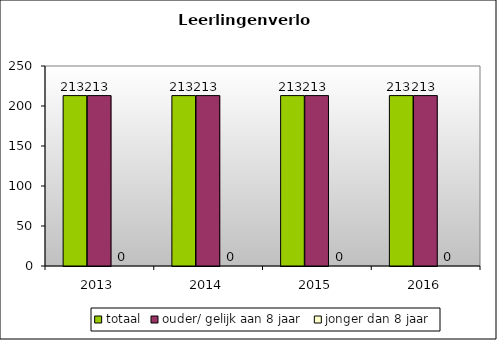
| Category | totaal | ouder/ gelijk aan 8 jaar | jonger dan 8 jaar |
|---|---|---|---|
| 2013.0 | 213 | 213 | 0 |
| 2014.0 | 213 | 213 | 0 |
| 2015.0 | 213 | 213 | 0 |
| 2016.0 | 213 | 213 | 0 |